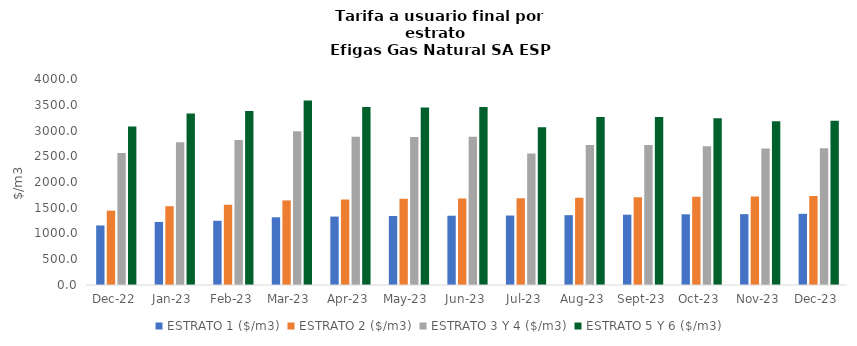
| Category | ESTRATO 1 ($/m3) | ESTRATO 2 ($/m3) | ESTRATO 3 Y 4 ($/m3) | ESTRATO 5 Y 6 ($/m3) |
|---|---|---|---|---|
| 2022-12-01 | 1156.03 | 1443.8 | 2563.93 | 3076.716 |
| 2023-01-01 | 1224.77 | 1529.93 | 2774 | 3328.8 |
| 2023-02-01 | 1247.16 | 1558.32 | 2816 | 3379.2 |
| 2023-03-01 | 1314.94 | 1642.54 | 2985.304 | 3582.364 |
| 2023-04-01 | 1328.75 | 1659.79 | 2880.614 | 3456.737 |
| 2023-05-01 | 1339.14 | 1672.77 | 2874.12 | 3448.944 |
| 2023-06-01 | 1344.99 | 1680.07 | 2880.614 | 3456.737 |
| 2023-07-01 | 1349.02 | 1685.11 | 2551.788 | 3062.145 |
| 2023-08-01 | 1355.78 | 1693.55 | 2720.369 | 3264.443 |
| 2023-09-01 | 1365.26 | 1705.39 | 2717.396 | 3260.875 |
| 2023-10-01 | 1372.52 | 1714.46 | 2696.262 | 3235.514 |
| 2023-11-01 | 1375.95 | 1718.74 | 2650.142 | 3180.171 |
| 2023-12-01 | 1382.4 | 1726.8 | 2657.262 | 3188.714 |